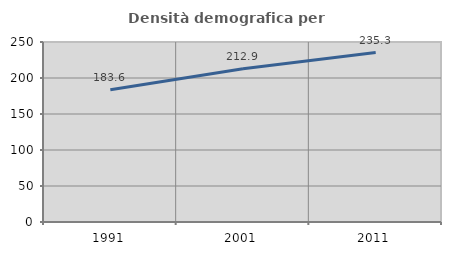
| Category | Densità demografica |
|---|---|
| 1991.0 | 183.58 |
| 2001.0 | 212.898 |
| 2011.0 | 235.286 |